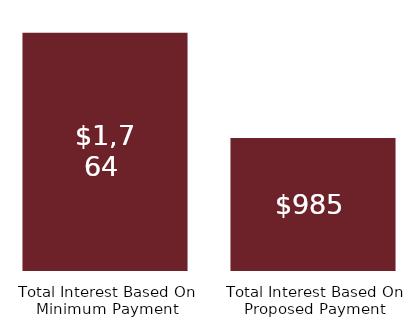
| Category | Series 0 |
|---|---|
| Total Interest Based On Minimum Payment | 1763.952 |
| Total Interest Based On Proposed Payment | 984.811 |